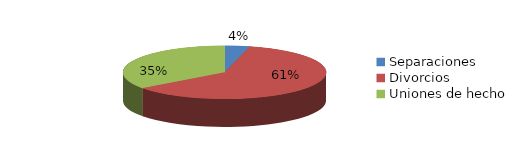
| Category | Series 0 |
|---|---|
| Separaciones | 63 |
| Divorcios | 966 |
| Uniones de hecho | 557 |